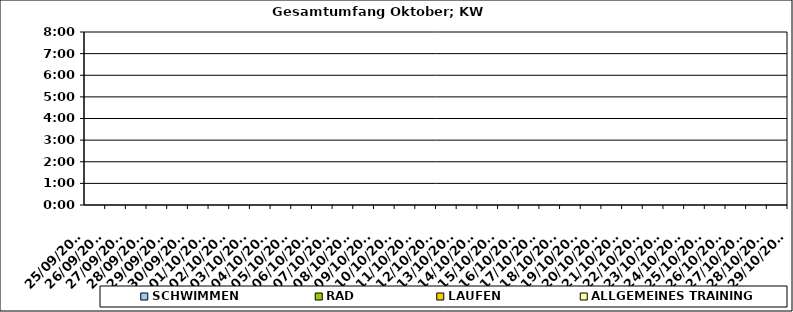
| Category | SCHWIMMEN | RAD | LAUFEN | ALLGEMEINES TRAINING |
|---|---|---|---|---|
| 25/09/2023 |  |  |  | 0 |
| 26/09/2023 |  |  |  | 0 |
| 27/09/2023 |  |  |  | 0 |
| 28/09/2023 |  |  |  | 0 |
| 29/09/2023 |  |  |  | 0 |
| 30/09/2023 |  |  |  | 0 |
| 01/10/2023 |  |  |  | 0 |
| 02/10/2023 |  |  |  | 0 |
| 03/10/2023 |  |  |  | 0 |
| 04/10/2023 |  |  |  | 0 |
| 05/10/2023 |  |  |  | 0 |
| 06/10/2023 |  |  |  | 0 |
| 07/10/2023 |  |  |  | 0 |
| 08/10/2023 |  |  |  | 0 |
| 09/10/2023 |  |  |  | 0 |
| 10/10/2023 |  |  |  | 0 |
| 11/10/2023 |  |  |  | 0 |
| 12/10/2023 |  |  |  | 0 |
| 13/10/2023 |  |  |  | 0 |
| 14/10/2023 |  |  |  | 0 |
| 15/10/2023 |  |  |  | 0 |
| 16/10/2023 |  |  |  | 0 |
| 17/10/2023 |  |  |  | 0 |
| 18/10/2023 |  |  |  | 0 |
| 19/10/2023 |  |  |  | 0 |
| 20/10/2023 |  |  |  | 0 |
| 21/10/2023 |  |  |  | 0 |
| 22/10/2023 |  |  |  | 0 |
| 23/10/2023 |  |  |  | 0 |
| 24/10/2023 |  |  |  | 0 |
| 25/10/2023 |  |  |  | 0 |
| 26/10/2023 |  |  |  | 0 |
| 27/10/2023 |  |  |  | 0 |
| 28/10/2023 |  |  |  | 0 |
| 29/10/2023 |  |  |  | 0 |